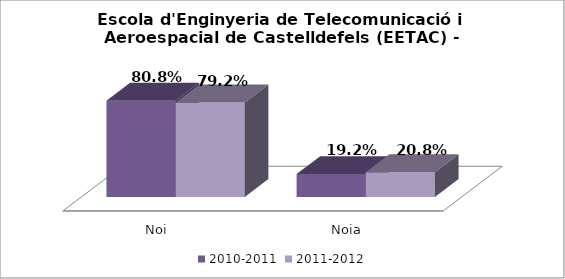
| Category | 2010-2011 | 2011-2012 |
|---|---|---|
| Noi | 0.808 | 0.792 |
| Noia | 0.192 | 0.208 |